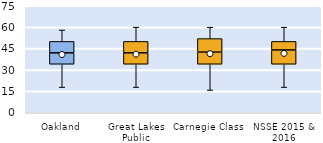
| Category | 25th | 50th | 75th |
|---|---|---|---|
| Oakland | 34 | 8 | 8 |
| Great Lakes Public | 34 | 8 | 8 |
| Carnegie Class | 34 | 8.5 | 9.5 |
| NSSE 2015 & 2016 | 34 | 10 | 6 |